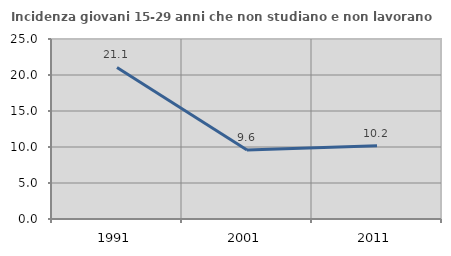
| Category | Incidenza giovani 15-29 anni che non studiano e non lavorano  |
|---|---|
| 1991.0 | 21.053 |
| 2001.0 | 9.589 |
| 2011.0 | 10.169 |